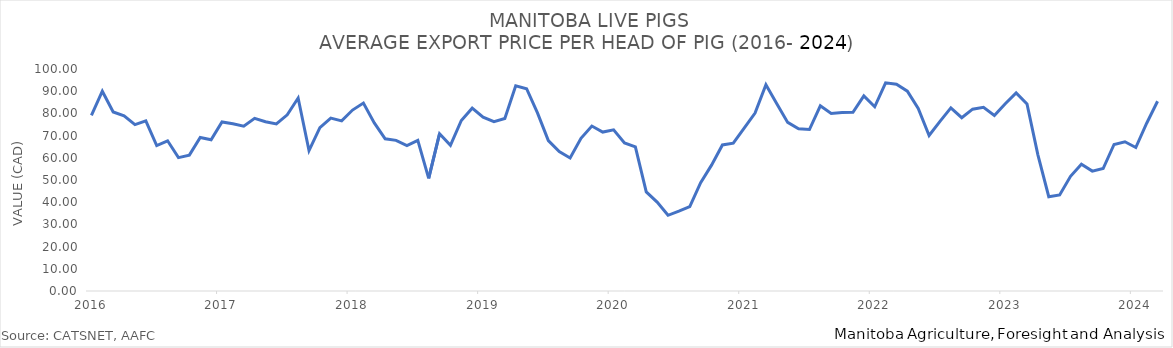
| Category | Total Pig P |
|---|---|
| 2016-01-01 | 79.131 |
| 2016-02-01 | 90.004 |
| 2016-03-01 | 80.662 |
| 2016-04-01 | 78.876 |
| 2016-05-01 | 74.947 |
| 2016-06-01 | 76.645 |
| 2016-07-01 | 65.49 |
| 2016-08-01 | 67.667 |
| 2016-09-01 | 60.058 |
| 2016-10-01 | 61.189 |
| 2016-11-01 | 69.171 |
| 2016-12-01 | 68.091 |
| 2017-01-01 | 76.147 |
| 2017-02-01 | 75.296 |
| 2017-03-01 | 74.253 |
| 2017-04-01 | 77.794 |
| 2017-05-01 | 76.252 |
| 2017-06-01 | 75.282 |
| 2017-07-01 | 79.349 |
| 2017-08-01 | 86.93 |
| 2017-09-01 | 63.25 |
| 2017-10-01 | 73.587 |
| 2017-11-01 | 77.881 |
| 2017-12-01 | 76.648 |
| 2018-01-01 | 81.507 |
| 2018-02-01 | 84.641 |
| 2018-03-01 | 75.733 |
| 2018-04-01 | 68.57 |
| 2018-05-01 | 67.862 |
| 2018-06-01 | 65.481 |
| 2018-07-01 | 67.852 |
| 2018-08-01 | 50.722 |
| 2018-09-01 | 70.863 |
| 2018-10-01 | 65.635 |
| 2018-11-01 | 76.82 |
| 2018-12-01 | 82.357 |
| 2019-01-01 | 78.308 |
| 2019-02-01 | 76.318 |
| 2019-03-01 | 77.68 |
| 2019-04-01 | 92.463 |
| 2019-05-01 | 91.121 |
| 2019-06-01 | 80.252 |
| 2019-07-01 | 67.724 |
| 2019-08-01 | 62.779 |
| 2019-09-01 | 59.91 |
| 2019-10-01 | 68.79 |
| 2019-11-01 | 74.311 |
| 2019-12-01 | 71.585 |
| 2020-01-01 | 72.584 |
| 2020-02-01 | 66.659 |
| 2020-03-01 | 64.964 |
| 2020-04-01 | 44.652 |
| 2020-05-01 | 40.063 |
| 2020-06-01 | 34.105 |
| 2020-07-01 | 35.98 |
| 2020-08-01 | 38.045 |
| 2020-09-01 | 48.832 |
| 2020-10-01 | 56.701 |
| 2020-11-01 | 65.776 |
| 2020-12-01 | 66.559 |
| 2021-01-01 | 73.402 |
| 2021-02-01 | 80.136 |
| 2021-03-01 | 92.955 |
| 2021-04-01 | 84.346 |
| 2021-05-01 | 75.952 |
| 2021-06-01 | 73.07 |
| 2021-07-01 | 72.732 |
| 2021-08-01 | 83.432 |
| 2021-09-01 | 79.934 |
| 2021-10-01 | 80.365 |
| 2021-11-01 | 80.48 |
| 2021-12-01 | 87.88 |
| 2022-01-01 | 82.997 |
| 2022-02-01 | 93.775 |
| 2022-03-01 | 93.11 |
| 2022-04-01 | 90.02 |
| 2022-05-01 | 82.285 |
| 2022-06-01 | 70.046 |
| 2022-07-01 | 76.413 |
| 2022-08-01 | 82.494 |
| 2022-09-01 | 78.075 |
| 2022-10-01 | 81.912 |
| 2022-11-01 | 82.718 |
| 2022-12-01 | 79.077 |
| 2023-01-01 | 84.359 |
| 2023-02-01 | 89.219 |
| 2023-03-01 | 84.279 |
| 2023-04-01 | 61.318 |
| 2023-05-01 | 42.461 |
| 2023-06-01 | 43.258 |
| 2023-07-01 | 51.665 |
| 2023-08-01 | 57.067 |
| 2023-09-01 | 53.998 |
| 2023-10-01 | 55.18 |
| 2023-11-01 | 66.004 |
| 2023-12-01 | 67.216 |
| 2024-01-01 | 64.626 |
| 2024-02-01 | 75.574 |
| 2024-03-01 | 85.486 |